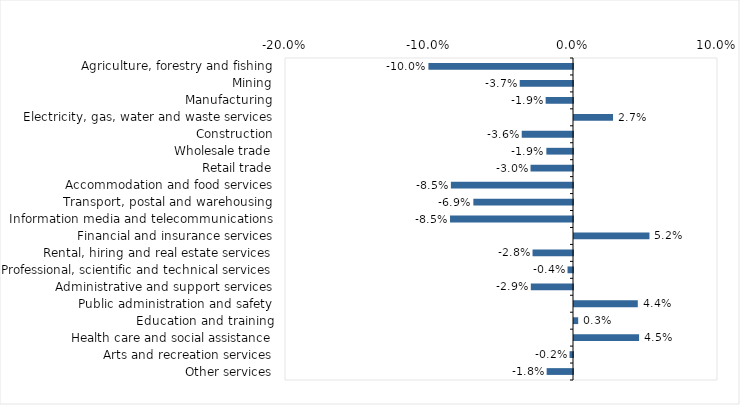
| Category | This week |
|---|---|
| Agriculture, forestry and fishing | -0.1 |
| Mining | -0.037 |
| Manufacturing | -0.019 |
| Electricity, gas, water and waste services | 0.027 |
| Construction | -0.036 |
| Wholesale trade | -0.018 |
| Retail trade | -0.03 |
| Accommodation and food services | -0.085 |
| Transport, postal and warehousing | -0.069 |
| Information media and telecommunications | -0.085 |
| Financial and insurance services | 0.052 |
| Rental, hiring and real estate services | -0.028 |
| Professional, scientific and technical services | -0.004 |
| Administrative and support services | -0.029 |
| Public administration and safety | 0.044 |
| Education and training | 0.003 |
| Health care and social assistance | 0.045 |
| Arts and recreation services | -0.002 |
| Other services | -0.018 |